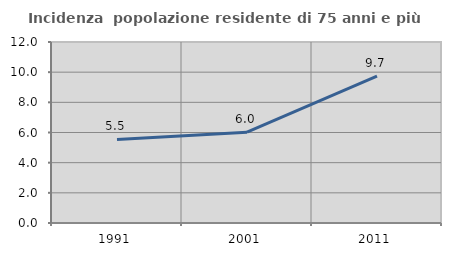
| Category | Incidenza  popolazione residente di 75 anni e più |
|---|---|
| 1991.0 | 5.54 |
| 2001.0 | 6.019 |
| 2011.0 | 9.731 |